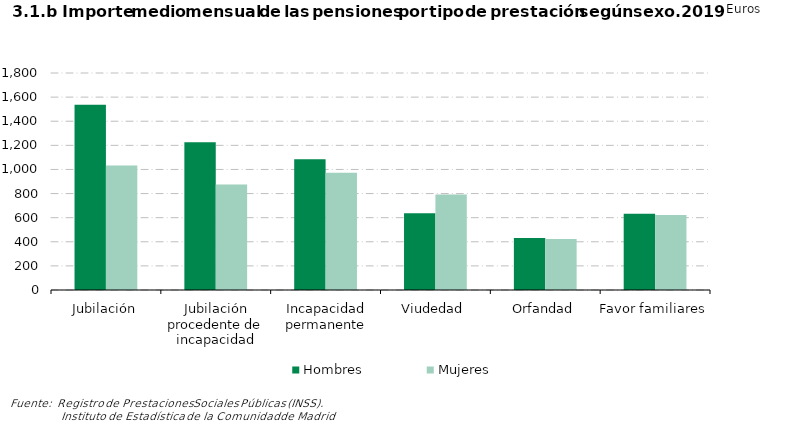
| Category | Hombres | Mujeres |
|---|---|---|
| Jubilación | 1536.667 | 1033.436 |
| Jubilación procedente de incapacidad | 1225.458 | 875.503 |
| Incapacidad permanente | 1084.94 | 971.789 |
| Viudedad | 637.395 | 791.353 |
| Orfandad | 431.115 | 422.416 |
| Favor familiares | 633.082 | 622.653 |